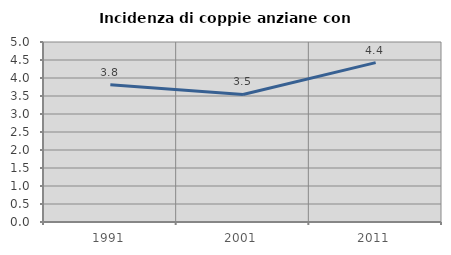
| Category | Incidenza di coppie anziane con figli |
|---|---|
| 1991.0 | 3.814 |
| 2001.0 | 3.543 |
| 2011.0 | 4.428 |